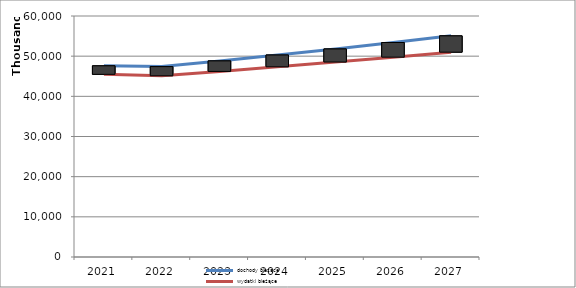
| Category | dochody bieżące | wydatki bieżące |
|---|---|---|
| 2021.0 | 47601770 | 45477372 |
| 2022.0 | 47400754 | 45115561 |
| 2023.0 | 48822776 | 46198335 |
| 2024.0 | 50287460 | 47353293 |
| 2025.0 | 51796084 | 48537126 |
| 2026.0 | 53401762 | 49750554 |
| 2027.0 | 55057217 | 50994317 |